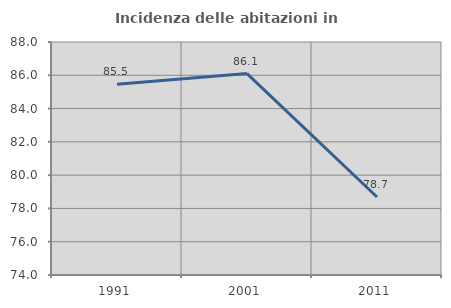
| Category | Incidenza delle abitazioni in proprietà  |
|---|---|
| 1991.0 | 85.457 |
| 2001.0 | 86.101 |
| 2011.0 | 78.685 |